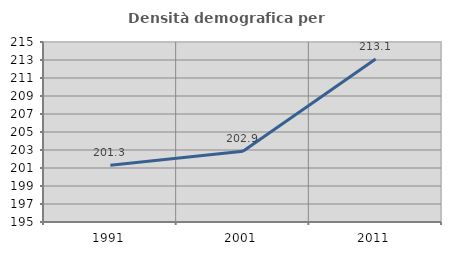
| Category | Densità demografica |
|---|---|
| 1991.0 | 201.317 |
| 2001.0 | 202.871 |
| 2011.0 | 213.123 |